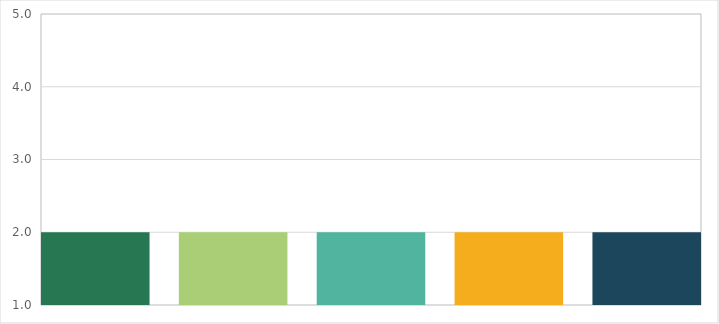
| Category | Series 2 | Series 3 | Series 6 | Series 8 | Series 10 |
|---|---|---|---|---|---|
| 0 | 2 | 2 | 2 | 2 | 2 |